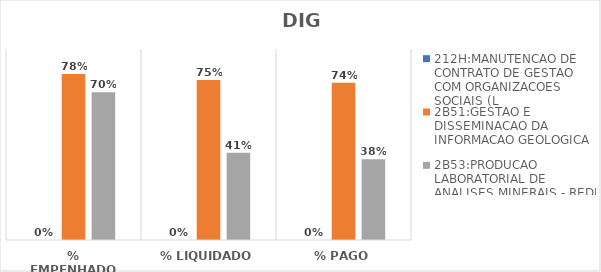
| Category | 212H:MANUTENCAO DE CONTRATO DE GESTAO COM ORGANIZACOES SOCIAIS (L | 2B51:GESTAO E DISSEMINACAO DA INFORMACAO GEOLOGICA | 2B53:PRODUCAO LABORATORIAL DE ANALISES MINERAIS - REDE LAMIN |
|---|---|---|---|
| % EMPENHADO | 0 | 0.782 | 0.696 |
| % LIQUIDADO | 0 | 0.754 | 0.411 |
| % PAGO | 0 | 0.741 | 0.381 |